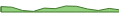
| Category | Series 0 |
|---|---|
| 0 | 18 |
| 1 | 16 |
| 2 | 5 |
| 3 | 2 |
| 4 | 13 |
| 5 | 11 |
| 6 | 20 |
| 7 | 19 |
| 8 | 10 |
| 9 | 5 |
| 10 | 12 |
| 11 | 7 |